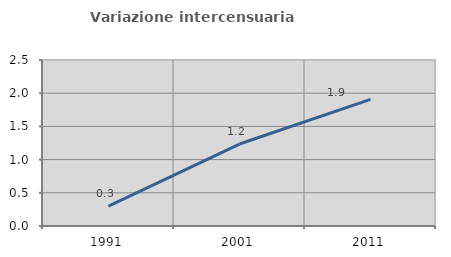
| Category | Variazione intercensuaria annua |
|---|---|
| 1991.0 | 0.3 |
| 2001.0 | 1.235 |
| 2011.0 | 1.908 |